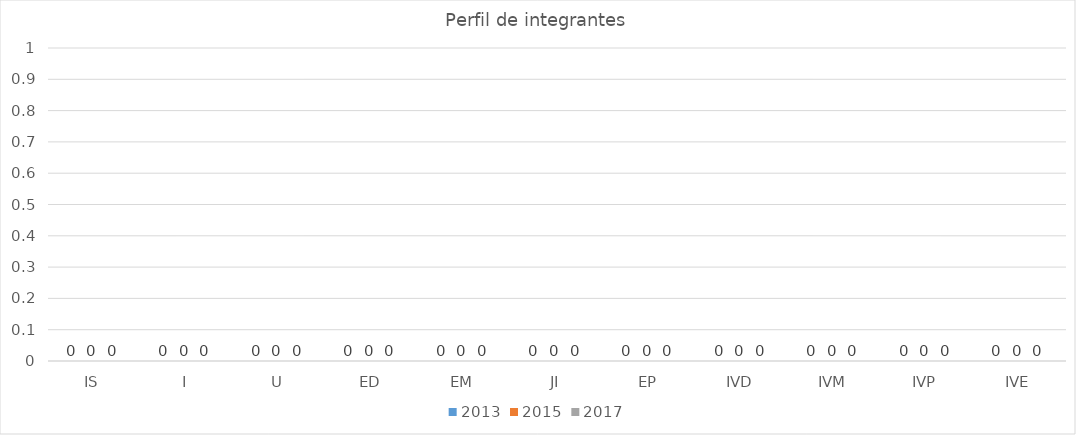
| Category | 2013 | 2015 | 2017 |
|---|---|---|---|
| IS | 0 | 0 | 0 |
| I | 0 | 0 | 0 |
| U | 0 | 0 | 0 |
| ED | 0 | 0 | 0 |
| EM | 0 | 0 | 0 |
| JI | 0 | 0 | 0 |
| EP | 0 | 0 | 0 |
| IVD | 0 | 0 | 0 |
| IVM | 0 | 0 | 0 |
| IVP | 0 | 0 | 0 |
| IVE | 0 | 0 | 0 |